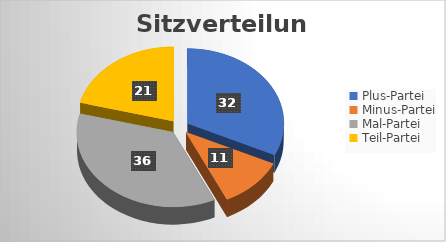
| Category | Series 0 |
|---|---|
| Plus-Partei | 32 |
| Minus-Partei | 11 |
| Mal-Partei | 36 |
| Teil-Partei | 21 |